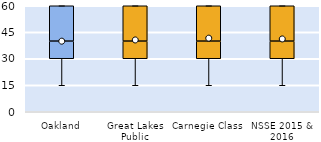
| Category | 25th | 50th | 75th |
|---|---|---|---|
| Oakland | 30 | 10 | 20 |
| Great Lakes Public | 30 | 10 | 20 |
| Carnegie Class | 30 | 10 | 20 |
| NSSE 2015 & 2016 | 30 | 10 | 20 |